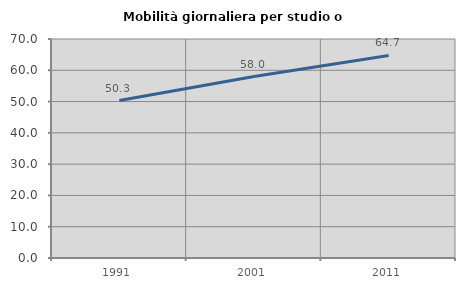
| Category | Mobilità giornaliera per studio o lavoro |
|---|---|
| 1991.0 | 50.342 |
| 2001.0 | 58.008 |
| 2011.0 | 64.738 |